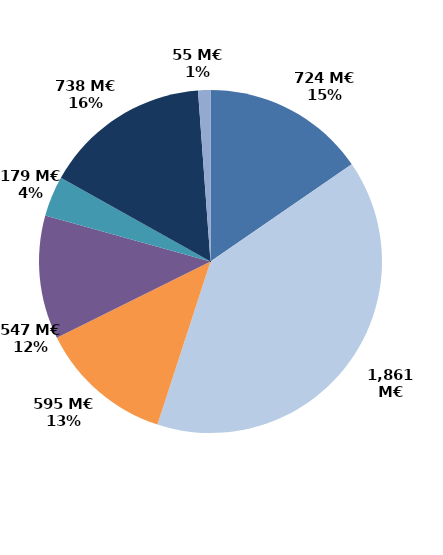
| Category | Series 0 |
|---|---|
| Accueil et information (CEP 1) | 723.773 |
| Accompagnement renforcé (CEP 2 et 3) | 1860.965 |
| Suivi | 595.273 |
| Missions locales | 546.733 |
| CSP | 179.227 |
| Aide à la création d'entreprise | 738.338 |
| Aide à l'insertion | 54.596 |